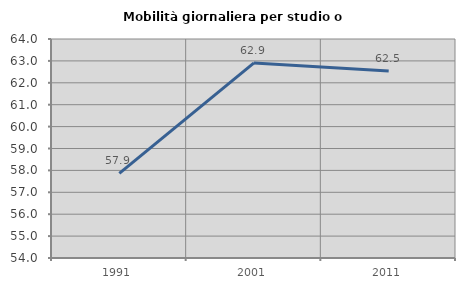
| Category | Mobilità giornaliera per studio o lavoro |
|---|---|
| 1991.0 | 57.866 |
| 2001.0 | 62.907 |
| 2011.0 | 62.542 |